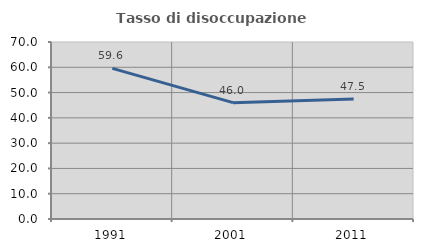
| Category | Tasso di disoccupazione giovanile  |
|---|---|
| 1991.0 | 59.582 |
| 2001.0 | 46.018 |
| 2011.0 | 47.493 |